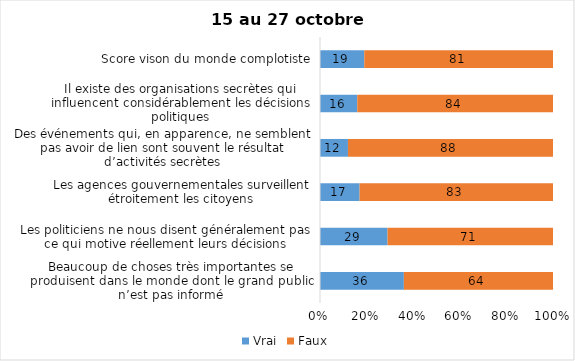
| Category | Vrai | Faux |
|---|---|---|
| Beaucoup de choses très importantes se produisent dans le monde dont le grand public n’est pas informé | 36 | 64 |
| Les politiciens ne nous disent généralement pas ce qui motive réellement leurs décisions | 29 | 71 |
| Les agences gouvernementales surveillent étroitement les citoyens | 17 | 83 |
| Des événements qui, en apparence, ne semblent pas avoir de lien sont souvent le résultat d’activités secrètes | 12 | 88 |
| Il existe des organisations secrètes qui influencent considérablement les décisions politiques | 16 | 84 |
| Score vison du monde complotiste | 19 | 81 |